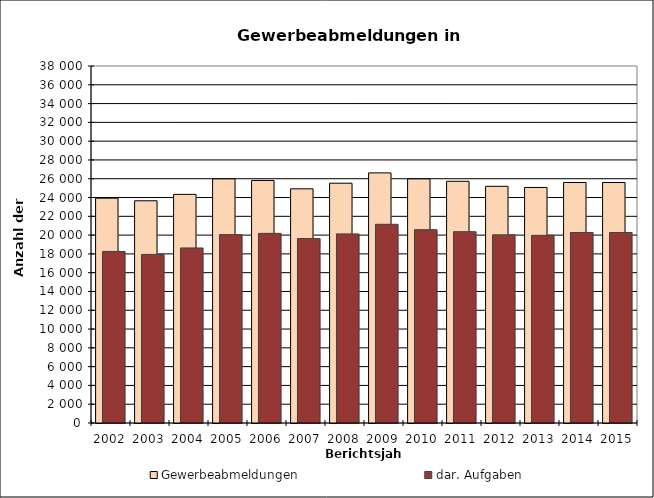
| Category | Gewerbeabmeldungen | dar. Aufgaben |
|---|---|---|
| 2002.0 | 23929 | 18260 |
| 2003.0 | 23654 | 17944 |
| 2004.0 | 24336 | 18633 |
| 2005.0 | 25984 | 20051 |
| 2006.0 | 25816 | 20185 |
| 2007.0 | 24926 | 19635 |
| 2008.0 | 25523 | 20128 |
| 2009.0 | 26623 | 21151 |
| 2010.0 | 25984 | 20578 |
| 2011.0 | 25729 | 20364 |
| 2012.0 | 25195 | 20027 |
| 2013.0 | 25071 | 19975 |
| 2014.0 | 25601 | 20280 |
| 2015.0 | 25601 | 20280 |